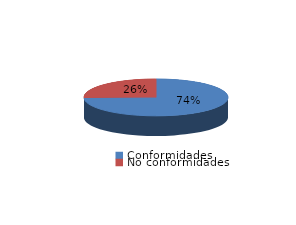
| Category | Series 0 |
|---|---|
| Conformidades | 1138 |
| No conformidades | 390 |